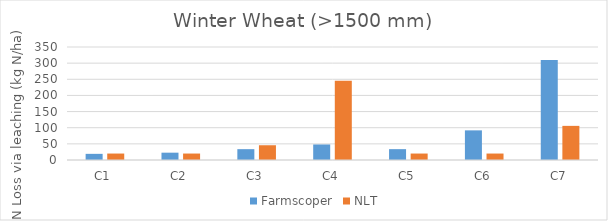
| Category | Farmscoper | NLT |
|---|---|---|
| C1 | 19.056 | 20 |
| C2 | 22.683 | 20 |
| C3 | 33.565 | 45.7 |
| C4 | 48.074 | 245.7 |
| C5 | 33.603 | 20 |
| C6 | 91.795 | 20 |
| C7 | 310.012 | 105.7 |